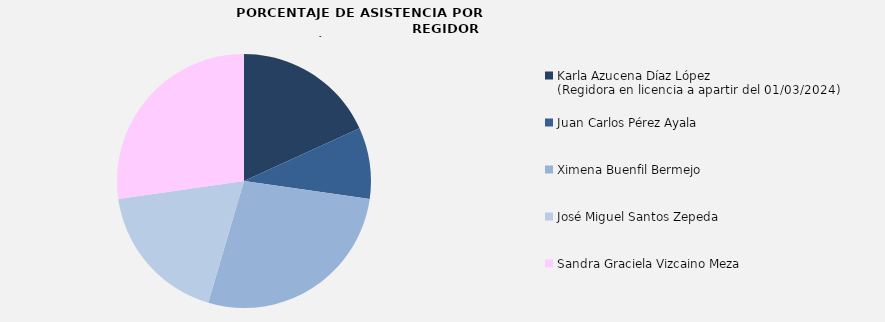
| Category | Series 0 |
|---|---|
| Karla Azucena Díaz López
(Regidora en licencia a apartir del 01/03/2024) | 66.667 |
| Juan Carlos Pérez Ayala | 33.333 |
| Ximena Buenfil Bermejo | 100 |
| José Miguel Santos Zepeda | 66.667 |
| Sandra Graciela Vizcaino Meza | 100 |